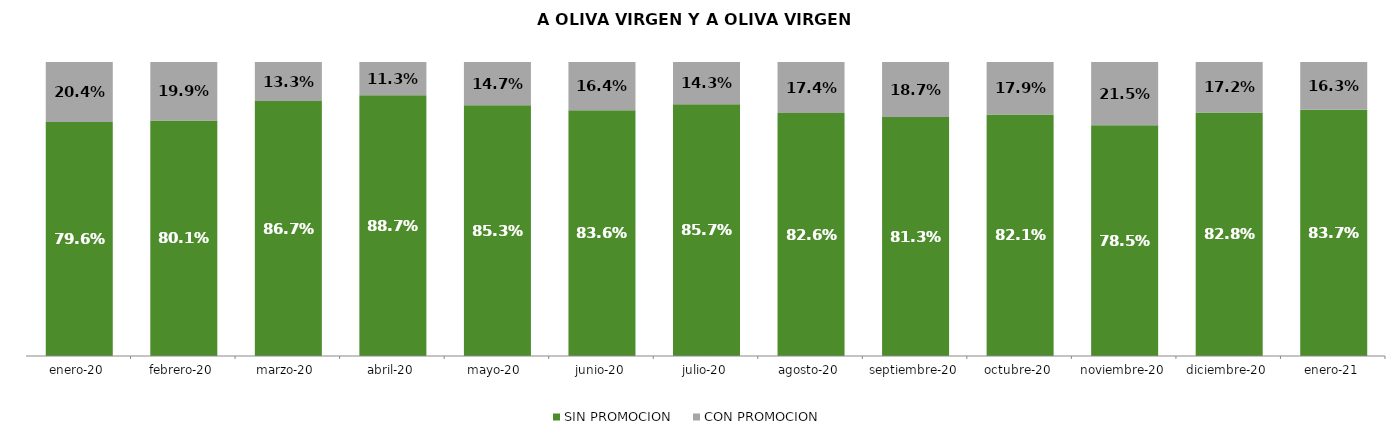
| Category | SIN PROMOCION   | CON PROMOCION   |
|---|---|---|
| 2020-01-01 | 0.796 | 0.204 |
| 2020-02-01 | 0.801 | 0.199 |
| 2020-03-01 | 0.867 | 0.133 |
| 2020-04-01 | 0.887 | 0.113 |
| 2020-05-01 | 0.853 | 0.147 |
| 2020-06-01 | 0.836 | 0.164 |
| 2020-07-01 | 0.857 | 0.143 |
| 2020-08-01 | 0.826 | 0.174 |
| 2020-09-01 | 0.813 | 0.187 |
| 2020-10-01 | 0.821 | 0.179 |
| 2020-11-01 | 0.785 | 0.215 |
| 2020-12-01 | 0.828 | 0.172 |
| 2021-01-01 | 0.837 | 0.163 |